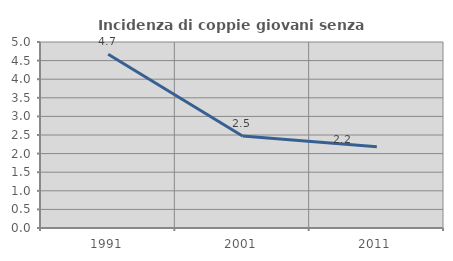
| Category | Incidenza di coppie giovani senza figli |
|---|---|
| 1991.0 | 4.673 |
| 2001.0 | 2.475 |
| 2011.0 | 2.186 |